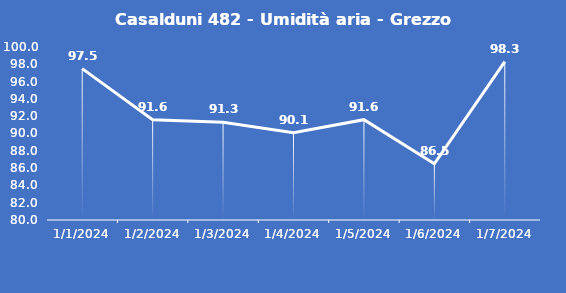
| Category | Casalduni 482 - Umidità aria - Grezzo (%) |
|---|---|
| 1/1/24 | 97.5 |
| 1/2/24 | 91.6 |
| 1/3/24 | 91.3 |
| 1/4/24 | 90.1 |
| 1/5/24 | 91.6 |
| 1/6/24 | 86.5 |
| 1/7/24 | 98.3 |